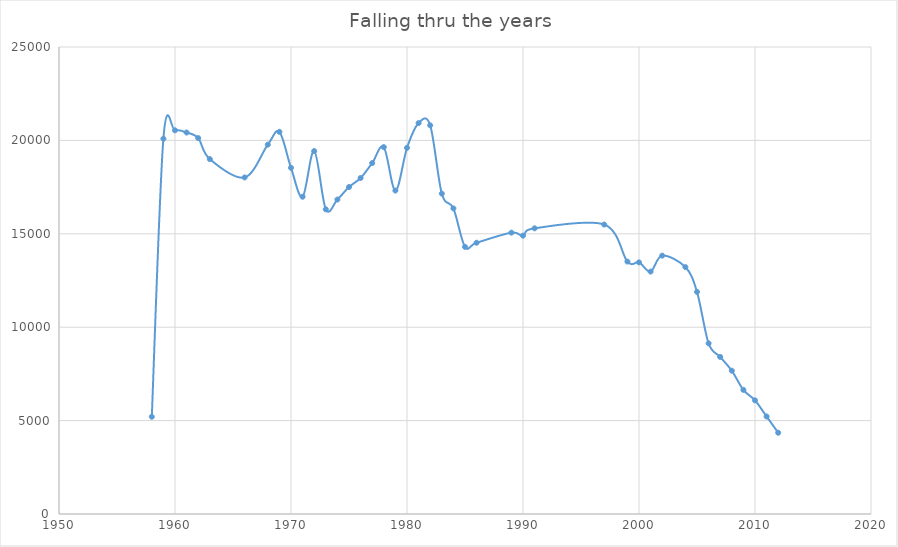
| Category | Series 0 |
|---|---|
| 1958.0 | 5205 |
| 1959.0 | 20092 |
| 1960.0 | 20540 |
| 1961.0 | 20422 |
| 1962.0 | 20124 |
| 1963.0 | 19000 |
| 1966.0 | 18017 |
| 1968.0 | 19773 |
| 1969.0 | 20459 |
| 1970.0 | 18533 |
| 1971.0 | 16984 |
| 1972.0 | 19430 |
| 1973.0 | 16310 |
| 1974.0 | 16834 |
| 1975.0 | 17504 |
| 1976.0 | 17987 |
| 1977.0 | 18787 |
| 1978.0 | 19641 |
| 1979.0 | 17315 |
| 1980.0 | 19601 |
| 1981.0 | 20927 |
| 1982.0 | 20806 |
| 1983.0 | 17151 |
| 1984.0 | 16361 |
| 1985.0 | 14301 |
| 1986.0 | 14522 |
| 1989.0 | 15061 |
| 1990.0 | 14900 |
| 1991.0 | 15293 |
| 1997.0 | 15496 |
| 1999.0 | 13513 |
| 2000.0 | 13471 |
| 2001.0 | 12977 |
| 2002.0 | 13832 |
| 2004.0 | 13217 |
| 2005.0 | 11890 |
| 2006.0 | 9134 |
| 2007.0 | 8408 |
| 2008.0 | 7671 |
| 2009.0 | 6644 |
| 2010.0 | 6083 |
| 2011.0 | 5220 |
| 2012.0 | 4350 |